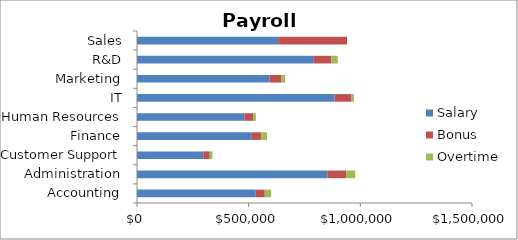
| Category | Salary | Bonus | Overtime |
|---|---|---|---|
| Accounting | 532000 | 40040 | 28890 |
| Administration | 852000 | 84870 | 39940 |
| Customer Support | 297000 | 28670 | 12010 |
| Finance | 514000 | 42330 | 25800 |
| Human Resources | 481000 | 38870 | 12570 |
| IT | 885000 | 73480 | 13170 |
| Marketing | 594000 | 51560 | 17720 |
| R&D | 792000 | 78950 | 27980 |
| Sales | 632000 | 308430 | 0 |